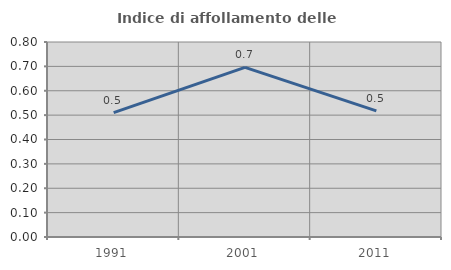
| Category | Indice di affollamento delle abitazioni  |
|---|---|
| 1991.0 | 0.51 |
| 2001.0 | 0.696 |
| 2011.0 | 0.517 |